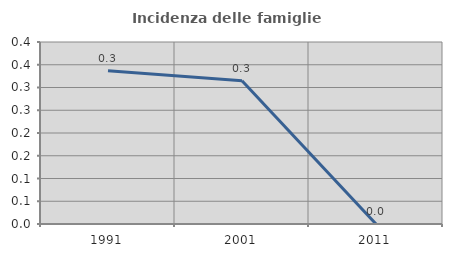
| Category | Incidenza delle famiglie numerose |
|---|---|
| 1991.0 | 0.337 |
| 2001.0 | 0.315 |
| 2011.0 | 0 |